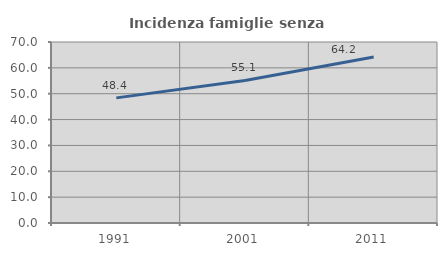
| Category | Incidenza famiglie senza nuclei |
|---|---|
| 1991.0 | 48.396 |
| 2001.0 | 55.143 |
| 2011.0 | 64.201 |